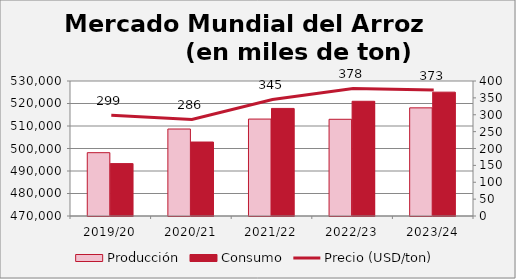
| Category | Producción | Consumo |
|---|---|---|
| 2019/20 | 498144 | 493281 |
| 2020/21 | 508661 | 502881 |
| 2021/22 | 513082 | 517814 |
| 2022/23 | 512983 | 520991 |
| 2023/24 | 518067 | 525046 |